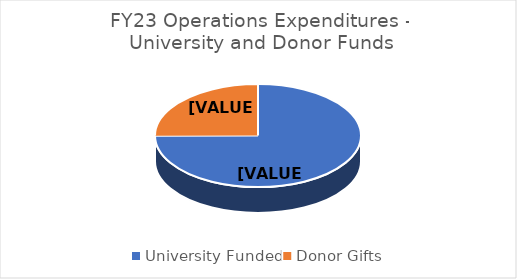
| Category | Series 0 |
|---|---|
| University Funded | 0.75 |
| Donor Gifts | 0.25 |